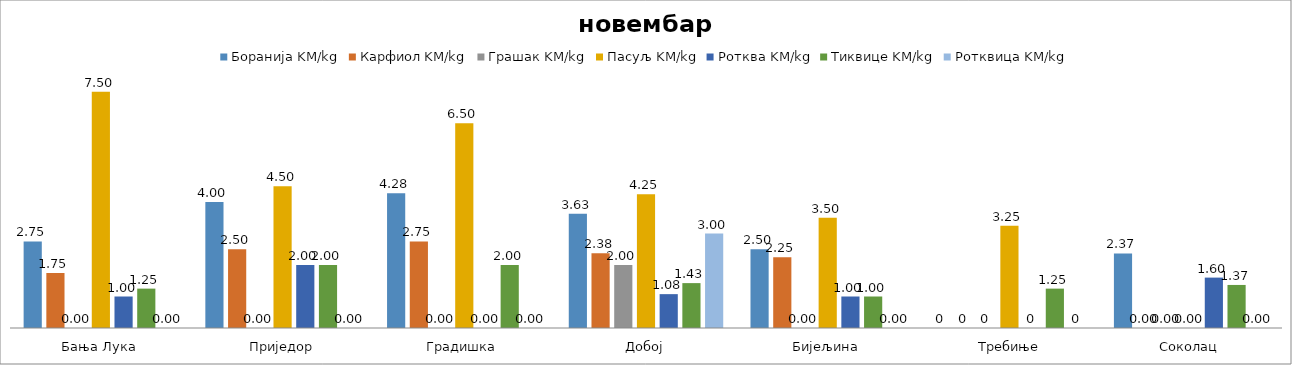
| Category | Боранија KM/kg | Карфиол KM/kg | Грашак KM/kg | Пасуљ KM/kg | Ротква KM/kg | Тиквице KM/kg | Ротквица KM/kg |
|---|---|---|---|---|---|---|---|
| Бања Лука | 2.75 | 1.75 | 0 | 7.5 | 1 | 1.25 | 0 |
| Приједор | 4 | 2.5 | 0 | 4.5 | 2 | 2 | 0 |
| Градишка | 4.275 | 2.75 | 0 | 6.5 | 0 | 2 | 0 |
| Добој | 3.625 | 2.375 | 2 | 4.25 | 1.075 | 1.425 | 3 |
| Бијељина | 2.5 | 2.25 | 0 | 3.5 | 1 | 1 | 0 |
|  Требиње | 0 | 0 | 0 | 3.25 | 0 | 1.25 | 0 |
| Соколац | 2.367 | 0 | 0 | 0 | 1.6 | 1.367 | 0 |